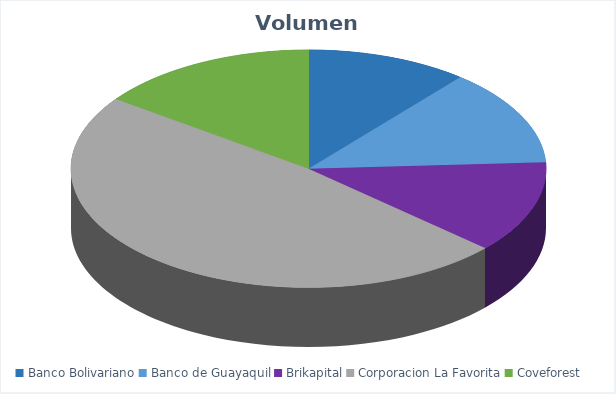
| Category | VOLUMEN ($USD) |
|---|---|
| Banco Bolivariano | 8800 |
| Banco de Guayaquil | 10491.81 |
| Brikapital | 10000 |
| Corporacion La Favorita | 38576.8 |
| Coveforest | 12001.6 |